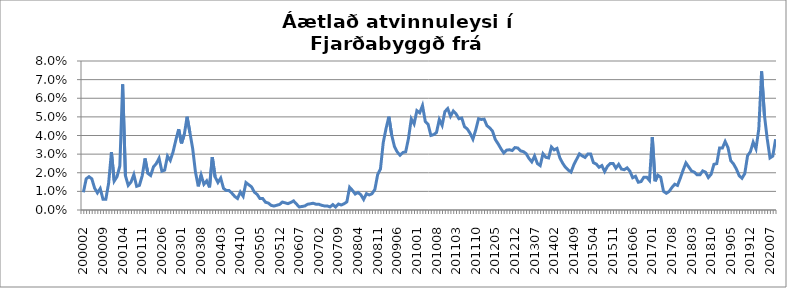
| Category | Series 0 |
|---|---|
| 200002 | 0.009 |
| 200003 | 0.017 |
| 200004 | 0.018 |
| 200005 | 0.017 |
| 200006 | 0.012 |
| 200007 | 0.009 |
| 200008 | 0.012 |
| 200009 | 0.006 |
| 200010 | 0.006 |
| 200011 | 0.014 |
| 200012 | 0.031 |
| 200101 | 0.016 |
| 200102 | 0.018 |
| 200103 | 0.024 |
| 200104 | 0.067 |
| 200105 | 0.018 |
| 200106 | 0.013 |
| 200107 | 0.015 |
| 200108 | 0.019 |
| 200109 | 0.013 |
| 200110 | 0.013 |
| 200111 | 0.018 |
| 200112 | 0.028 |
| 200201 | 0.02 |
| 200202 | 0.019 |
| 200203 | 0.023 |
| 200204 | 0.025 |
| 200205 | 0.028 |
| 200206 | 0.021 |
| 200207 | 0.021 |
| 200208 | 0.029 |
| 200209 | 0.027 |
| 200210 | 0.031 |
| 200211 | 0.038 |
| 200212 | 0.043 |
| 200301 | 0.036 |
| 200302 | 0.041 |
| 200303 | 0.05 |
| 200304 | 0.042 |
| 200305 | 0.033 |
| 200306 | 0.02 |
| 200307 | 0.013 |
| 200308 | 0.019 |
| 200309 | 0.014 |
| 200310 | 0.016 |
| 200311 | 0.012 |
| 200312 | 0.028 |
| 200401 | 0.018 |
| 200402 | 0.015 |
| 200403 | 0.017 |
| 200404 | 0.012 |
| 200405 | 0.01 |
| 200406 | 0.01 |
| 200407 | 0.009 |
| 200408 | 0.007 |
| 200409 | 0.006 |
| 200410 | 0.01 |
| 200411 | 0.007 |
| 200412 | 0.015 |
| 200501 | 0.014 |
| 200502 | 0.012 |
| 200503 | 0.01 |
| 200504 | 0.008 |
| 200505 | 0.006 |
| 200506 | 0.006 |
| 200507 | 0.004 |
| 200508 | 0.004 |
| 200509 | 0.002 |
| 200510 | 0.002 |
| 200511 | 0.003 |
| 200512 | 0.003 |
| 200601 | 0.004 |
| 200602 | 0.004 |
| 200603 | 0.003 |
| 200604 | 0.004 |
| 200605 | 0.005 |
| 200606 | 0.003 |
| 200607 | 0.002 |
| 200608 | 0.002 |
| 200609 | 0.002 |
| 200610 | 0.003 |
| 200611 | 0.003 |
| 200612 | 0.004 |
| 200701 | 0.003 |
| 200702 | 0.003 |
| 200703 | 0.003 |
| 200704 | 0.002 |
| 200705 | 0.002 |
| 200706 | 0.002 |
| 200707 | 0.003 |
| 200708 | 0.002 |
| 200709 | 0.003 |
| 200710 | 0.003 |
| 200711 | 0.003 |
| 200712 | 0.004 |
| 200801 | 0.012 |
| 200802 | 0.011 |
| 200803 | 0.009 |
| 200804 | 0.009 |
| 200805 | 0.008 |
| 200806 | 0.006 |
| 200807 | 0.009 |
| 200808 | 0.008 |
| 200809 | 0.009 |
| 200810 | 0.011 |
| 200811 | 0.019 |
| 200812 | 0.022 |
| 200901 | 0.036 |
| 200902 | 0.044 |
| 200903 | 0.05 |
| 200904 | 0.04 |
| 200905 | 0.034 |
| 200906 | 0.031 |
| 200907 | 0.029 |
| 200908 | 0.031 |
| 200909 | 0.031 |
| 200910 | 0.038 |
| 200911 | 0.049 |
| 200912 | 0.046 |
| 201001 | 0.053 |
| 201002 | 0.052 |
| 201003 | 0.056 |
| 201004 | 0.048 |
| 201005 | 0.046 |
| 201006 | 0.04 |
| 201007 | 0.04 |
| 201008 | 0.042 |
| 201009 | 0.049 |
| 201010 | 0.045 |
| 201011 | 0.053 |
| 201012 | 0.054 |
| 201101 | 0.05 |
| 201102 | 0.053 |
| 201103 | 0.052 |
| 201104 | 0.049 |
| 201105 | 0.049 |
| 201106 | 0.045 |
| 201107 | 0.043 |
| 201108 | 0.041 |
| 201109 | 0.038 |
| 201110 | 0.043 |
| 201111 | 0.049 |
| 201112 | 0.049 |
| 201201 | 0.049 |
| 201202 | 0.045 |
| 201203 | 0.044 |
| 201204 | 0.042 |
| 201205 | 0.038 |
| 201206 | 0.036 |
| 201207 | 0.033 |
| 201208 | 0.031 |
| 201209 | 0.032 |
| 201210 | 0.032 |
| 201211 | 0.032 |
| 201212 | 0.034 |
| 201301 | 0.033 |
| 201302 | 0.032 |
| 201303 | 0.031 |
| 201304 | 0.03 |
| 201305 | 0.028 |
| 201306 | 0.026 |
| 201307 | 0.029 |
| 201308 | 0.025 |
| 201309 | 0.024 |
| 201310 | 0.03 |
| 201311 | 0.028 |
| 201312 | 0.028 |
| 201401 | 0.034 |
| 201402 | 0.032 |
| 201403 | 0.033 |
| 201404 | 0.028 |
| 201405 | 0.025 |
| 201406 | 0.023 |
| 201407 | 0.021 |
| 201408 | 0.02 |
| 201409 | 0.024 |
| 201410 | 0.027 |
| 201411 | 0.03 |
| 201412 | 0.029 |
| 201501 | 0.028 |
| 201502 | 0.03 |
| 201503 | 0.03 |
| 201504 | 0.025 |
| 201505 | 0.025 |
| 201506 | 0.023 |
| 201507 | 0.024 |
| 201508 | 0.021 |
| 201509 | 0.023 |
| 201510 | 0.025 |
| 201511 | 0.025 |
| 201512 | 0.022 |
| 201601 | 0.025 |
| 201602 | 0.022 |
| 201603 | 0.022 |
| 201604 | 0.023 |
| 201605 | 0.021 |
| 201606 | 0.017 |
| 201607 | 0.018 |
| 201608 | 0.015 |
| 201609 | 0.015 |
| 201610 | 0.018 |
| 201611 | 0.018 |
| 201612 | 0.016 |
| 201701 | 0.039 |
| 201702 | 0.015 |
| 201703 | 0.019 |
| 201704 | 0.018 |
| 201705 | 0.01 |
| 201706 | 0.009 |
| 201707 | 0.01 |
| 201708 | 0.012 |
| 201709 | 0.014 |
| 201710 | 0.013 |
| 201711 | 0.017 |
| 201712 | 0.021 |
| 201801 | 0.025 |
| 201802 | 0.023 |
| 201803 | 0.021 |
| 201804 | 0.02 |
| 201805 | 0.019 |
| 201806 | 0.019 |
| 201807 | 0.021 |
| 201808 | 0.02 |
| 201809 | 0.017 |
| 201810 | 0.019 |
| 201811 | 0.025 |
| 201812 | 0.025 |
| 201901 | 0.033 |
| 201902 | 0.033 |
| 201903 | 0.037 |
| 201904 | 0.034 |
| 201905 | 0.026 |
| 201906 | 0.025 |
| 201907 | 0.022 |
| 201908 | 0.018 |
| 201909 | 0.017 |
| 201910 | 0.02 |
| 201911 | 0.029 |
| 201912 | 0.031 |
| 202001 | 0.036 |
| 202002 | 0.033 |
| 202003 | 0.043 |
| 202004 | 0.074 |
| 202005 | 0.051 |
| 202006 | 0.038 |
| 202007 | 0.028 |
| 202008 | 0.029 |
| 202009 | 0.038 |